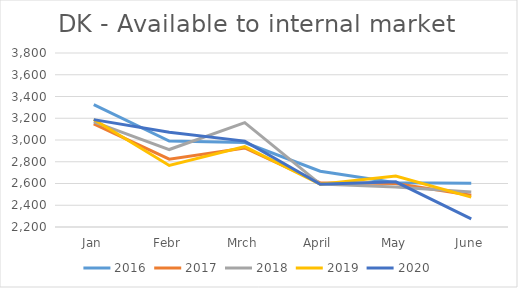
| Category | 2016 | 2017 | 2018 | 2019 | 2020 |
|---|---|---|---|---|---|
| Jan | 3325 | 3148.502 | 3167.287 | 3188.21 | 3187.423 |
| Febr | 2990 | 2823.321 | 2912.307 | 2766.003 | 3070.967 |
| Mrch | 2976 | 2927.113 | 3159.24 | 2938.914 | 2989.756 |
| April | 2713 | 2605.766 | 2594.224 | 2593.21 | 2593.73 |
| May | 2608 | 2599.848 | 2567.575 | 2667.798 | 2615.72 |
| June | 2602 | 2491.297 | 2522.182 | 2474.444 | 2274.85 |